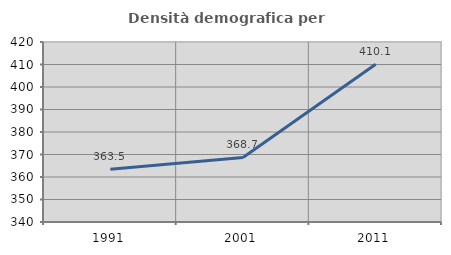
| Category | Densità demografica |
|---|---|
| 1991.0 | 363.492 |
| 2001.0 | 368.667 |
| 2011.0 | 410.073 |